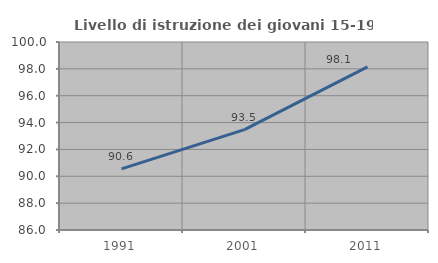
| Category | Livello di istruzione dei giovani 15-19 anni |
|---|---|
| 1991.0 | 90.551 |
| 2001.0 | 93.478 |
| 2011.0 | 98.148 |